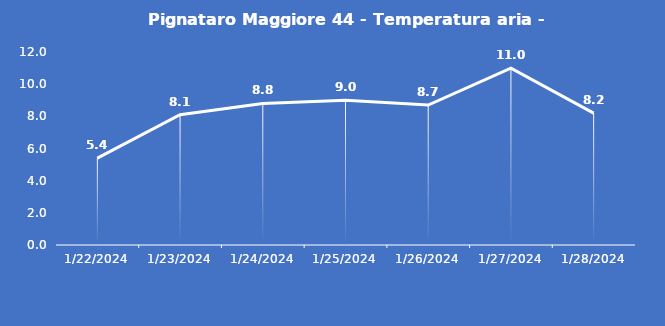
| Category | Pignataro Maggiore 44 - Temperatura aria - Grezzo (°C) |
|---|---|
| 1/22/24 | 5.4 |
| 1/23/24 | 8.1 |
| 1/24/24 | 8.8 |
| 1/25/24 | 9 |
| 1/26/24 | 8.7 |
| 1/27/24 | 11 |
| 1/28/24 | 8.2 |